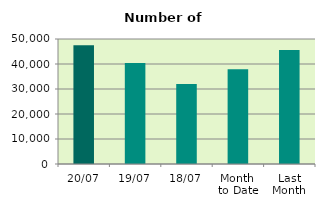
| Category | Series 0 |
|---|---|
| 20/07 | 47474 |
| 19/07 | 40438 |
| 18/07 | 31998 |
| Month 
to Date | 37933.571 |
| Last
Month | 45645.364 |